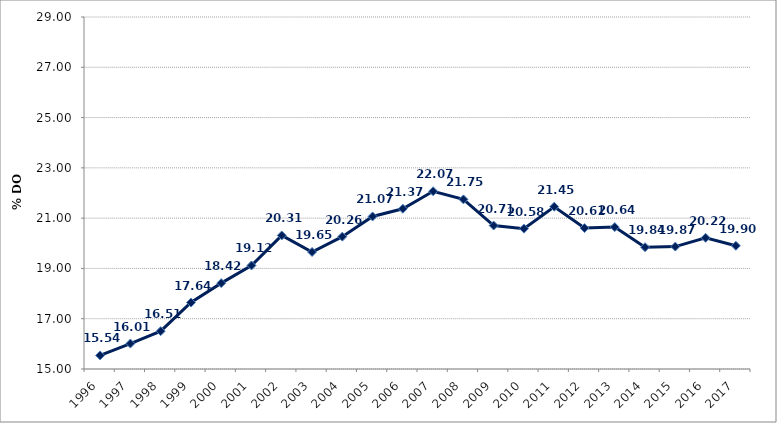
| Category | Series 0 |
|---|---|
| 1996 | 15.54 |
| 1997 | 16.011 |
| 1998 | 16.505 |
| 1999 | 17.644 |
| 2000 | 18.415 |
| 2001 | 19.117 |
| 2002 | 20.311 |
| 2003 | 19.654 |
| 2004 | 20.264 |
| 2005 | 21.068 |
| 2006 | 21.374 |
| 2007 | 22.069 |
| 2008 | 21.746 |
| 2009 | 20.706 |
| 2010 | 20.581 |
| 2011 | 21.454 |
| 2012 | 20.605 |
| 2013 | 20.644 |
| 2014 | 19.844 |
| 2015 | 19.868 |
| 2016 | 20.218 |
| 2017 | 19.901 |